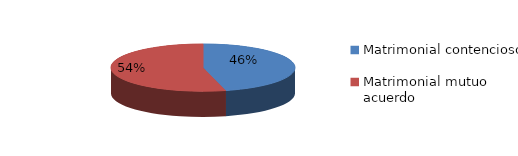
| Category | Series 0 |
|---|---|
| 0 | 769 |
| 1 | 902 |